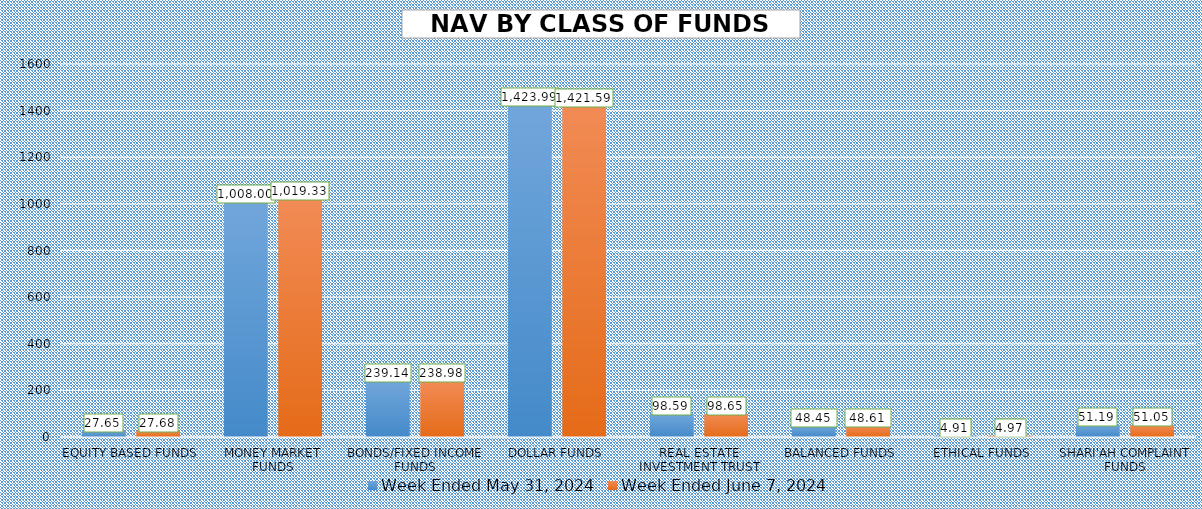
| Category | Week Ended May 31, 2024 | Week Ended June 7, 2024 |
|---|---|---|
| EQUITY BASED FUNDS | 27.654 | 27.685 |
| MONEY MARKET FUNDS | 1007.999 | 1019.332 |
| BONDS/FIXED INCOME FUNDS | 239.139 | 238.985 |
| DOLLAR FUNDS | 1423.985 | 1421.593 |
| REAL ESTATE INVESTMENT TRUST | 98.591 | 98.65 |
| BALANCED FUNDS | 48.453 | 48.611 |
| ETHICAL FUNDS | 4.909 | 4.968 |
| SHARI'AH COMPLAINT FUNDS | 51.193 | 51.055 |